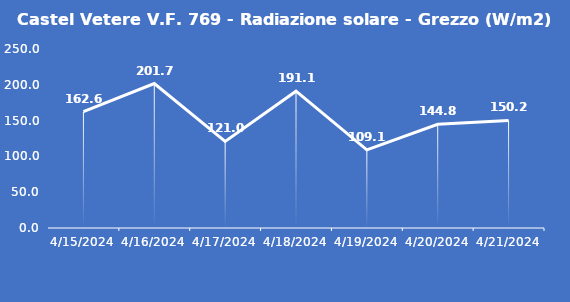
| Category | Castel Vetere V.F. 769 - Radiazione solare - Grezzo (W/m2) |
|---|---|
| 4/15/24 | 162.6 |
| 4/16/24 | 201.7 |
| 4/17/24 | 121 |
| 4/18/24 | 191.1 |
| 4/19/24 | 109.1 |
| 4/20/24 | 144.8 |
| 4/21/24 | 150.2 |